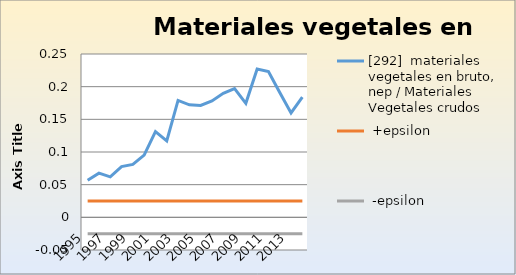
| Category | [292]  materiales vegetales en bruto, nep / Materiales Vegetales crudos |  +epsilon |  -epsilon |
|---|---|---|---|
| 1995.0 | 0.057 | 0.025 | -0.025 |
| 1996.0 | 0.068 | 0.025 | -0.025 |
| 1997.0 | 0.062 | 0.025 | -0.025 |
| 1998.0 | 0.078 | 0.025 | -0.025 |
| 1999.0 | 0.081 | 0.025 | -0.025 |
| 2000.0 | 0.095 | 0.025 | -0.025 |
| 2001.0 | 0.131 | 0.025 | -0.025 |
| 2002.0 | 0.117 | 0.025 | -0.025 |
| 2003.0 | 0.179 | 0.025 | -0.025 |
| 2004.0 | 0.172 | 0.025 | -0.025 |
| 2005.0 | 0.171 | 0.025 | -0.025 |
| 2006.0 | 0.178 | 0.025 | -0.025 |
| 2007.0 | 0.19 | 0.025 | -0.025 |
| 2008.0 | 0.197 | 0.025 | -0.025 |
| 2009.0 | 0.175 | 0.025 | -0.025 |
| 2010.0 | 0.227 | 0.025 | -0.025 |
| 2011.0 | 0.223 | 0.025 | -0.025 |
| 2012.0 | 0.191 | 0.025 | -0.025 |
| 2013.0 | 0.16 | 0.025 | -0.025 |
| 2014.0 | 0.184 | 0.025 | -0.025 |